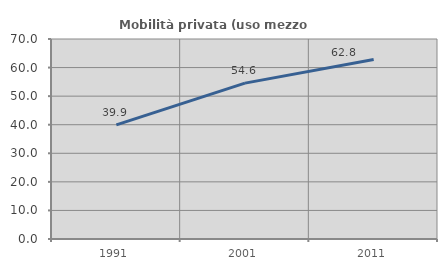
| Category | Mobilità privata (uso mezzo privato) |
|---|---|
| 1991.0 | 39.927 |
| 2001.0 | 54.558 |
| 2011.0 | 62.811 |